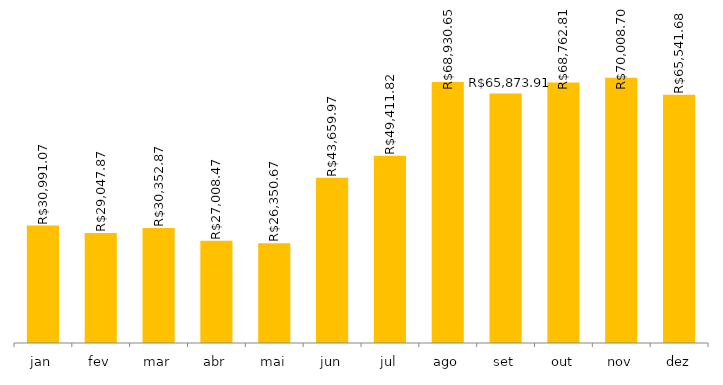
| Category | 2017 |
|---|---|
| jan | 30991.07 |
| fev | 29047.87 |
| mar | 30352.87 |
| abr | 27008.47 |
| mai | 26350.67 |
| jun | 43659.97 |
| jul | 49411.82 |
| ago | 68930.65 |
| set | 65873.91 |
| out | 68762.81 |
| nov | 70008.7 |
| dez | 65541.68 |